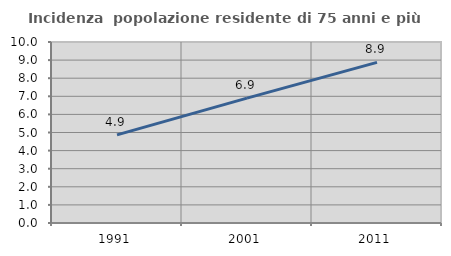
| Category | Incidenza  popolazione residente di 75 anni e più |
|---|---|
| 1991.0 | 4.868 |
| 2001.0 | 6.897 |
| 2011.0 | 8.874 |